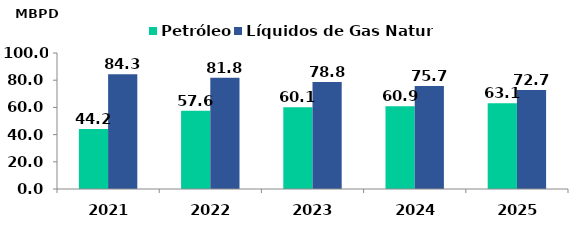
| Category | Petróleo | Líquidos de Gas Natural |
|---|---|---|
| 2021.0 | 44.168 | 84.312 |
| 2022.0 | 57.551 | 81.766 |
| 2023.0 | 60.139 | 78.757 |
| 2024.0 | 60.936 | 75.747 |
| 2025.0 | 63.066 | 72.738 |